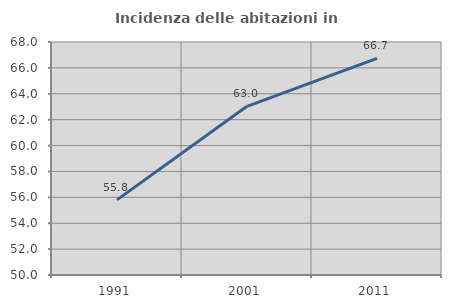
| Category | Incidenza delle abitazioni in proprietà  |
|---|---|
| 1991.0 | 55.802 |
| 2001.0 | 63.031 |
| 2011.0 | 66.733 |